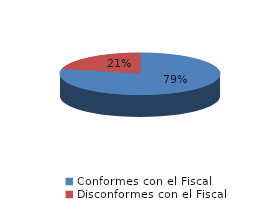
| Category | Series 0 |
|---|---|
| 0 | 74 |
| 1 | 20 |